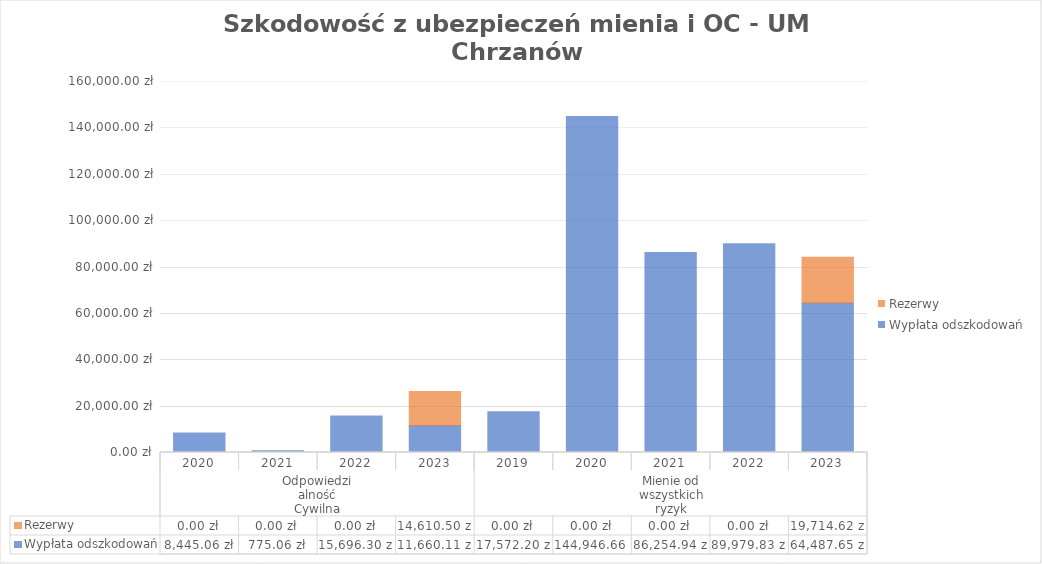
| Category | Wypłata odszkodowań | Rezerwy |
|---|---|---|
| 0 | 8445.06 | 0 |
| 1 | 775.06 | 0 |
| 2 | 15696.3 | 0 |
| 3 | 11660.11 | 14610.5 |
| 4 | 17572.2 | 0 |
| 5 | 144946.66 | 0 |
| 6 | 86254.94 | 0 |
| 7 | 89979.83 | 0 |
| 8 | 64487.65 | 19714.62 |